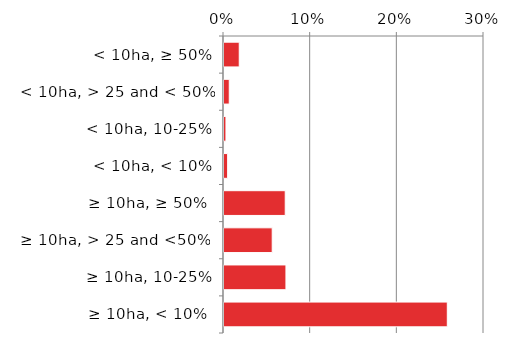
| Category | Non native |
|---|---|
|  ≥ 10ha, < 10%  | 0.259 |
|   ≥ 10ha, 10-25% | 0.073 |
|   ≥ 10ha, > 25 and <50%  | 0.057 |
|   ≥ 10ha, ≥ 50%  | 0.072 |
|  < 10ha, < 10% | 0.005 |
|  < 10ha, 10-25% | 0.003 |
|  < 10ha, > 25 and < 50% | 0.007 |
|  < 10ha, ≥ 50% | 0.019 |